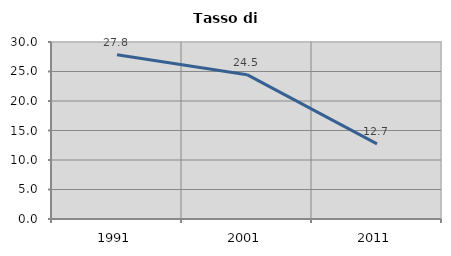
| Category | Tasso di disoccupazione   |
|---|---|
| 1991.0 | 27.828 |
| 2001.0 | 24.466 |
| 2011.0 | 12.731 |